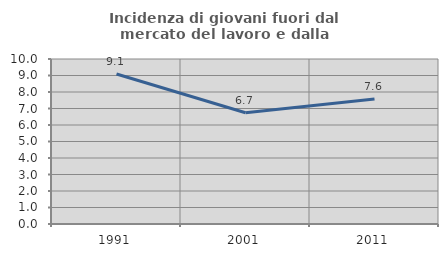
| Category | Incidenza di giovani fuori dal mercato del lavoro e dalla formazione  |
|---|---|
| 1991.0 | 9.091 |
| 2001.0 | 6.742 |
| 2011.0 | 7.576 |